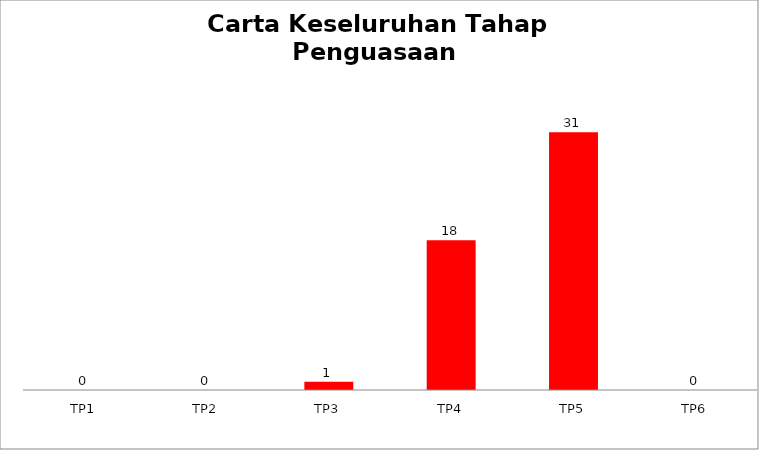
| Category | Bil Pel |
|---|---|
| TP1 | 0 |
| TP2 | 0 |
| TP3 | 1 |
| TP4 | 18 |
| TP5 | 31 |
| TP6 | 0 |